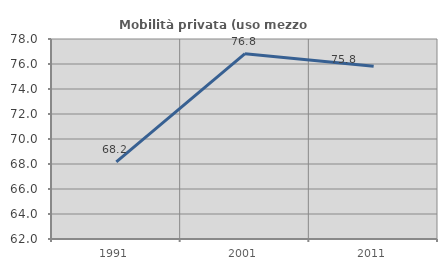
| Category | Mobilità privata (uso mezzo privato) |
|---|---|
| 1991.0 | 68.166 |
| 2001.0 | 76.829 |
| 2011.0 | 75.828 |